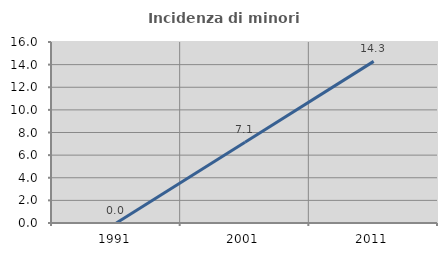
| Category | Incidenza di minori stranieri |
|---|---|
| 1991.0 | 0 |
| 2001.0 | 7.143 |
| 2011.0 | 14.286 |